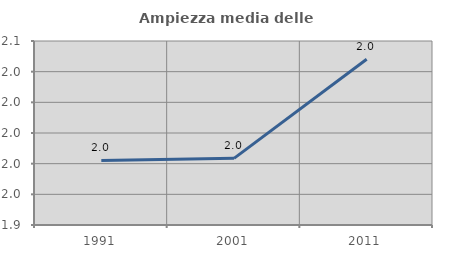
| Category | Ampiezza media delle famiglie |
|---|---|
| 1991.0 | 1.982 |
| 2001.0 | 1.983 |
| 2011.0 | 2.048 |